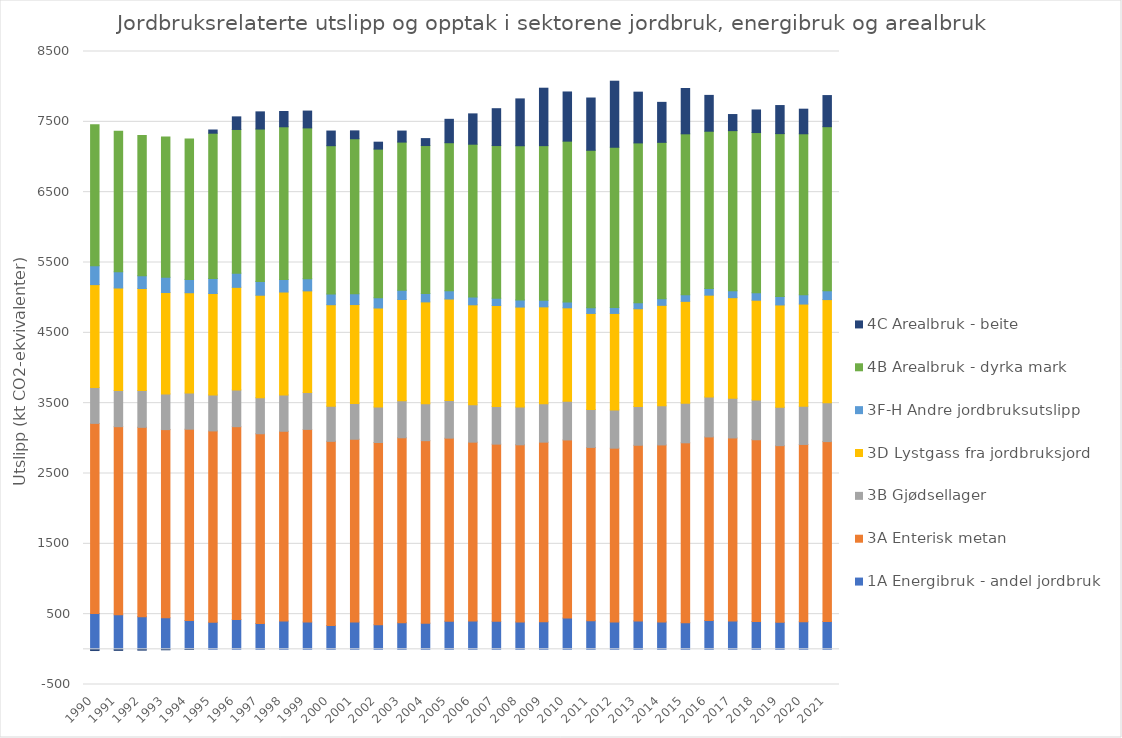
| Category | 1A Energibruk - andel jordbruk | 3A Enterisk metan | 3B Gjødsellager | 3D Lystgass fra jordbruksjord | 3F-H Andre jordbruksutslipp | 4B Arealbruk - dyrka mark | 4C Arealbruk - beite |
|---|---|---|---|---|---|---|---|
| 1990.0 | 508.267 | 2704.356 | 510.638 | 1462.18 | 269.387 | 2005.297 | -17.065 |
| 1991.0 | 490.475 | 2675.116 | 515.485 | 1456.363 | 230.957 | 1997.798 | -14.889 |
| 1992.0 | 464.142 | 2692.042 | 522.296 | 1451.294 | 182.404 | 1994.165 | -11.638 |
| 1993.0 | 448.036 | 2676.132 | 507.188 | 1441.728 | 216.206 | 1993.657 | -6.365 |
| 1994.0 | 409.368 | 2720.451 | 513.486 | 1426.835 | 189.795 | 1997.562 | -0.906 |
| 1995.0 | 384.126 | 2721.295 | 511.213 | 1442.307 | 213.771 | 2065.598 | 45.527 |
| 1996.0 | 425.23 | 2740.561 | 522.122 | 1458.765 | 202.186 | 2042.607 | 179.128 |
| 1997.0 | 368.523 | 2696.415 | 512.355 | 1457.509 | 196.259 | 2166.316 | 244.314 |
| 1998.0 | 402.386 | 2697.957 | 516.284 | 1463.709 | 177.042 | 2172.152 | 217.078 |
| 1999.0 | 388.54 | 2738.668 | 525.122 | 1444.236 | 173.805 | 2143.365 | 239.269 |
| 2000.0 | 337.282 | 2619.884 | 500.258 | 1442.231 | 152.932 | 2108.136 | 208.3 |
| 2001.0 | 387.221 | 2599.855 | 507.25 | 1407.83 | 151.945 | 2205.445 | 111.839 |
| 2002.0 | 349.539 | 2590.904 | 505.984 | 1406.655 | 145.348 | 2113.627 | 98.649 |
| 2003.0 | 378.3 | 2629.681 | 526.856 | 1438.668 | 131.743 | 2106.877 | 156.619 |
| 2004.0 | 372.257 | 2594.443 | 526.781 | 1446.421 | 120.209 | 2102.68 | 98.772 |
| 2005.0 | 400.687 | 2602.127 | 533.72 | 1444.191 | 116.616 | 2105.723 | 332.742 |
| 2006.0 | 402.814 | 2542.646 | 530.343 | 1422.613 | 110.057 | 2173.638 | 430.979 |
| 2007.0 | 398.424 | 2519.032 | 535.252 | 1435.715 | 104.474 | 2169.784 | 524.003 |
| 2008.0 | 388.909 | 2518.97 | 537.197 | 1421.264 | 101.871 | 2191.964 | 665.788 |
| 2009.0 | 390.739 | 2554.874 | 546.083 | 1377.734 | 92.513 | 2199.446 | 816.694 |
| 2010.0 | 444.084 | 2532.955 | 551.075 | 1327.527 | 82.711 | 2286.965 | 699.312 |
| 2011.0 | 404.634 | 2466.236 | 538.311 | 1366.607 | 81.574 | 2238.362 | 742.915 |
| 2012.0 | 387.877 | 2472.226 | 544.168 | 1371.447 | 83.608 | 2279.195 | 939.151 |
| 2013.0 | 404.262 | 2497.333 | 552.033 | 1388.659 | 84.935 | 2273.188 | 721.516 |
| 2014.0 | 389.631 | 2516.533 | 555.695 | 1429.161 | 92.752 | 2224.729 | 568.388 |
| 2015.0 | 379.449 | 2556.937 | 561.345 | 1449.632 | 94.273 | 2287.996 | 644.498 |
| 2016.0 | 409.385 | 2610.692 | 568.478 | 1447.333 | 92.781 | 2237.899 | 509.42 |
| 2017.0 | 402.538 | 2602.844 | 563.327 | 1431.224 | 97.751 | 2277.428 | 228.694 |
| 2018.0 | 395.754 | 2584.11 | 564.371 | 1419.503 | 105.411 | 2278.373 | 321.196 |
| 2019.0 | 384.168 | 2511.851 | 546.462 | 1453.95 | 118.604 | 2317.38 | 399.114 |
| 2020.0 | 392.16 | 2520.709 | 543.158 | 1453.042 | 131.65 | 2289.482 | 349.714 |
| 2021.0 | 396.43 | 2557.236 | 551.284 | 1467.882 | 125.304 | 2332.997 | 442.238 |